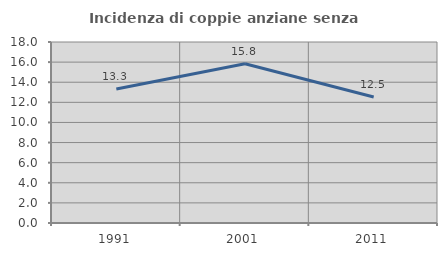
| Category | Incidenza di coppie anziane senza figli  |
|---|---|
| 1991.0 | 13.333 |
| 2001.0 | 15.831 |
| 2011.0 | 12.536 |